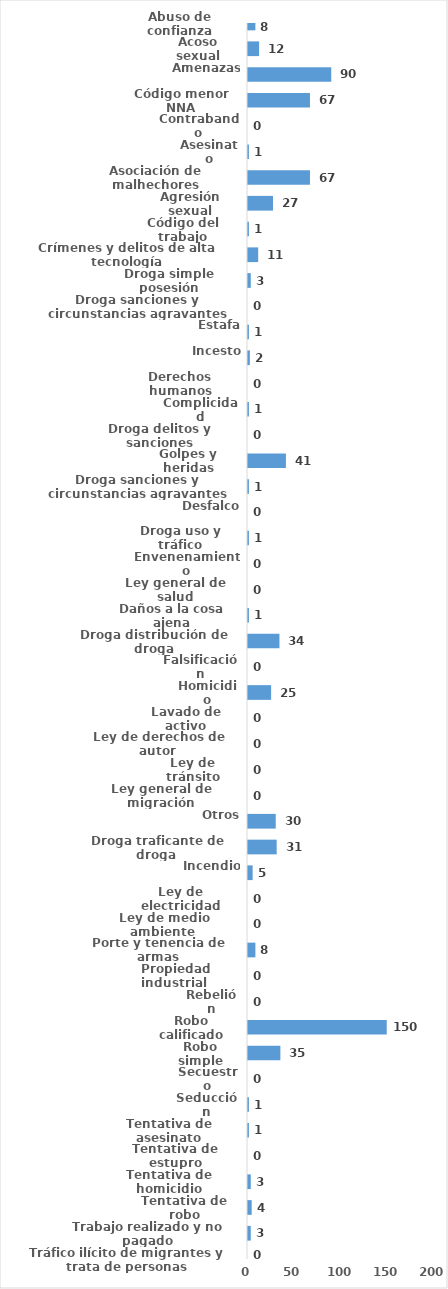
| Category | Series 0 |
|---|---|
| Abuso de confianza | 8 |
| Acoso sexual | 12 |
| Amenazas | 90 |
| Código menor NNA | 67 |
| Contrabando | 0 |
| Asesinato | 1 |
| Asociación de malhechores | 67 |
| Agresión sexual | 27 |
| Código del trabajo | 1 |
| Crímenes y delitos de alta tecnología | 11 |
| Droga simple posesión | 3 |
| Droga sanciones y circunstancias agravantes | 0 |
| Estafa | 1 |
| Incesto | 2 |
| Derechos humanos | 0 |
| Complicidad | 1 |
| Droga delitos y sanciones | 0 |
| Golpes y heridas | 41 |
| Droga sanciones y circunstancias agravantes | 1 |
| Desfalco | 0 |
| Droga uso y tráfico | 1 |
| Envenenamiento | 0 |
| Ley general de salud | 0 |
| Daños a la cosa ajena | 1 |
| Droga distribución de droga | 34 |
| Falsificación | 0 |
| Homicidio | 25 |
| Lavado de activo | 0 |
| Ley de derechos de autor  | 0 |
| Ley de tránsito | 0 |
| Ley general de migración | 0 |
| Otros | 30 |
| Droga traficante de droga  | 31 |
| Incendio | 5 |
| Ley de electricidad | 0 |
| Ley de medio ambiente  | 0 |
| Porte y tenencia de armas | 8 |
| Propiedad industrial  | 0 |
| Rebelión | 0 |
| Robo calificado | 150 |
| Robo simple | 35 |
| Secuestro | 0 |
| Seducción | 1 |
| Tentativa de asesinato | 1 |
| Tentativa de estupro | 0 |
| Tentativa de homicidio | 3 |
| Tentativa de robo | 4 |
| Trabajo realizado y no pagado | 3 |
| Tráfico ilícito de migrantes y trata de personas | 0 |